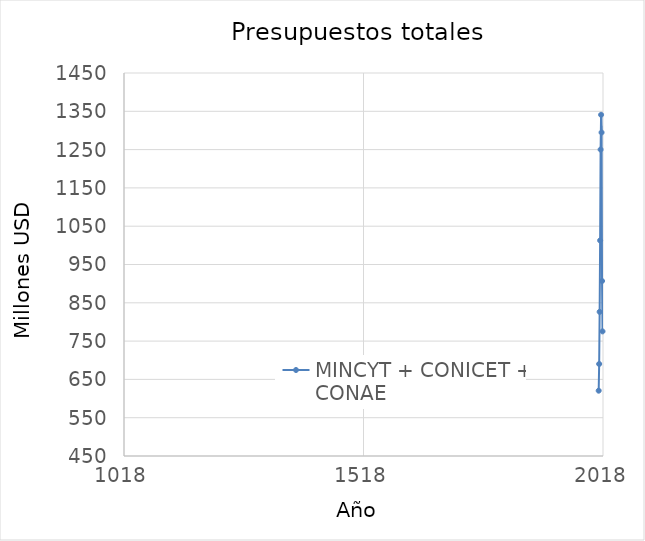
| Category | MINCYT + CONICET + CONAE |
|---|---|
| 2009.0 | 620.542 |
| 2010.0 | 690.25 |
| 2011.0 | 826.407 |
| 2012.0 | 1012.823 |
| 2013.0 | 1250.122 |
| 2014.0 | 1340.858 |
| 2015.0 | 1294.664 |
| 2016.0 | 906.888 |
| 2017.0 | 775.367 |